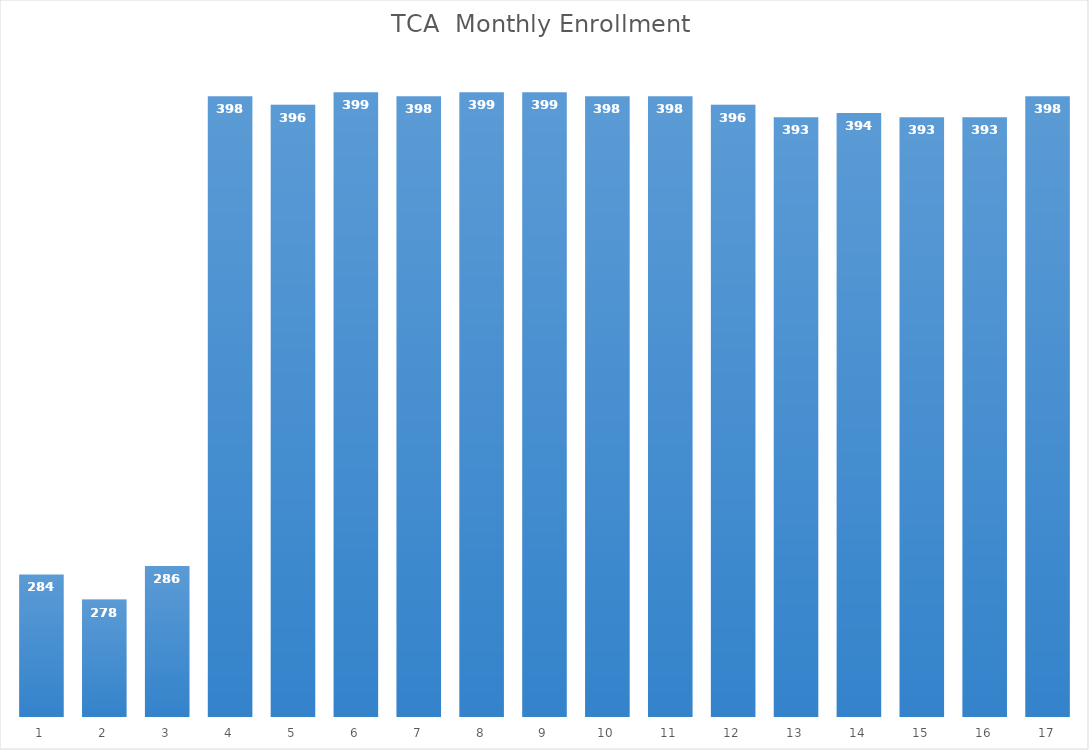
| Category | Series 0 |
|---|---|
| 0 | 284 |
| 1900-01-01 | 278 |
| 1900-01-02 | 286 |
| 1900-01-03 | 398 |
| 1900-01-04 | 396 |
| 1900-01-05 | 399 |
| 1900-01-06 | 398 |
| 1900-01-07 | 399 |
| 1900-01-08 | 399 |
| 1900-01-09 | 398 |
| 1900-01-10 | 398 |
| 1900-01-11 | 396 |
| 1900-01-12 | 393 |
| 1900-01-13 | 394 |
| 1900-01-14 | 393 |
| 1900-01-15 | 393 |
| 1900-01-16 | 398 |